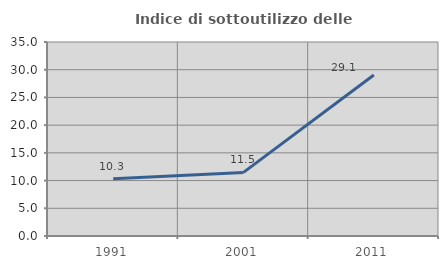
| Category | Indice di sottoutilizzo delle abitazioni  |
|---|---|
| 1991.0 | 10.345 |
| 2001.0 | 11.475 |
| 2011.0 | 29.056 |